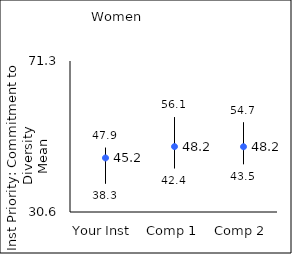
| Category | 25th percentile | 75th percentile | Mean |
|---|---|---|---|
| Your Inst | 38.3 | 47.9 | 45.17 |
| Comp 1 | 42.4 | 56.1 | 48.23 |
| Comp 2 | 43.5 | 54.7 | 48.19 |